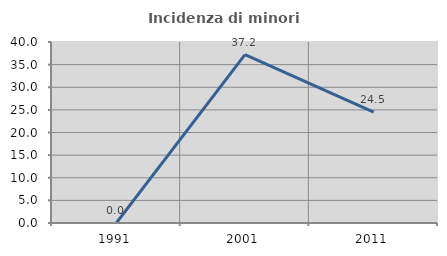
| Category | Incidenza di minori stranieri |
|---|---|
| 1991.0 | 0 |
| 2001.0 | 37.209 |
| 2011.0 | 24.49 |